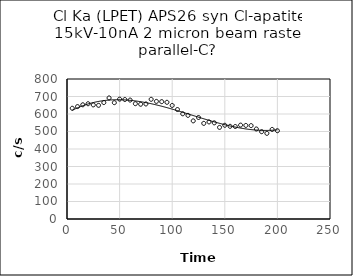
| Category | Series 0 |
|---|---|
| 5.0 | 632.8 |
| 10.0 | 642.4 |
| 15.0 | 652.6 |
| 20.0 | 658.6 |
| 25.0 | 652 |
| 30.0 | 649.4 |
| 35.0 | 665.4 |
| 40.0 | 691.8 |
| 45.0 | 664.8 |
| 50.0 | 685 |
| 55.0 | 682.8 |
| 60.0 | 679.6 |
| 65.0 | 659 |
| 70.0 | 655.6 |
| 75.0 | 657.4 |
| 80.0 | 684 |
| 85.0 | 672 |
| 90.0 | 670.6 |
| 95.0 | 666.8 |
| 100.0 | 649 |
| 105.0 | 625.6 |
| 110.0 | 601.2 |
| 115.0 | 592.2 |
| 120.0 | 560.8 |
| 125.0 | 580 |
| 130.0 | 546.4 |
| 135.0 | 554.8 |
| 140.0 | 549.4 |
| 145.0 | 523.4 |
| 150.0 | 535.6 |
| 155.0 | 529.6 |
| 160.0 | 528.6 |
| 165.0 | 536.6 |
| 170.0 | 534.8 |
| 175.0 | 533.6 |
| 180.0 | 514.4 |
| 185.0 | 499 |
| 190.0 | 489.4 |
| 195.0 | 511.8 |
| 200.0 | 504.4 |